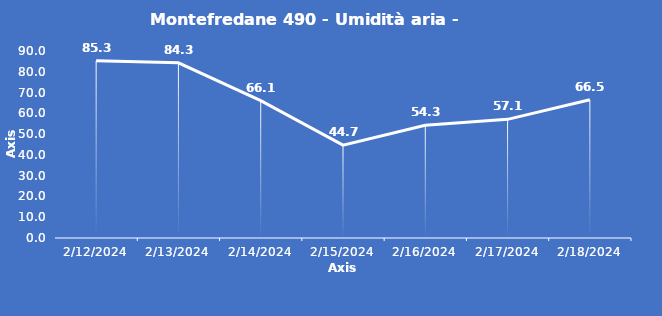
| Category | Montefredane 490 - Umidità aria - Grezzo (%) |
|---|---|
| 2/12/24 | 85.3 |
| 2/13/24 | 84.3 |
| 2/14/24 | 66.1 |
| 2/15/24 | 44.7 |
| 2/16/24 | 54.3 |
| 2/17/24 | 57.1 |
| 2/18/24 | 66.5 |